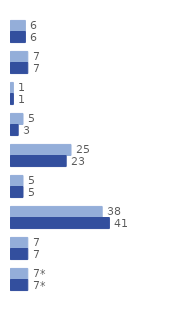
| Category | 2008-2012 | 2013-2018 |
|---|---|---|
| 0 | 6 | 6 |
| 1 | 7 | 7 |
| 2 | 1 | 1 |
| 3 | 5 | 3 |
| 4 | 25 | 23 |
| 5 | 5 | 5 |
| 6 | 38 | 41 |
| 7 | 7 | 7 |
| 8 | 7 | 7 |